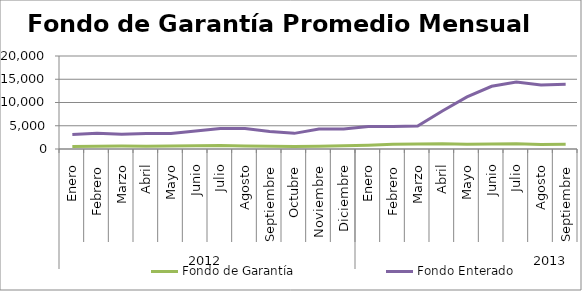
| Category | Fondo de Garantía | Fondo Enterado |
|---|---|---|
| 0 | 560.173 | 3141.641 |
| 1 | 575.916 | 3362.648 |
| 2 | 622.075 | 3154.118 |
| 3 | 612.299 | 3348.058 |
| 4 | 654.277 | 3308.859 |
| 5 | 675.965 | 3850.375 |
| 6 | 729.97 | 4400.539 |
| 7 | 649.095 | 4383.327 |
| 8 | 606.03 | 3757.632 |
| 9 | 525.314 | 3362.932 |
| 10 | 591.646 | 4285.609 |
| 11 | 703.403 | 4296.87 |
| 12 | 823.344 | 4842.786 |
| 13 | 1008.855 | 4845.136 |
| 14 | 1091.101 | 4938.365 |
| 15 | 1128.09 | 8179.666 |
| 16 | 1047.818 | 11202.213 |
| 17 | 1079.154 | 13493.433 |
| 18 | 1130.244 | 14387.844 |
| 19 | 950.791 | 13769.803 |
| 20 | 1002.474 | 13899.147 |